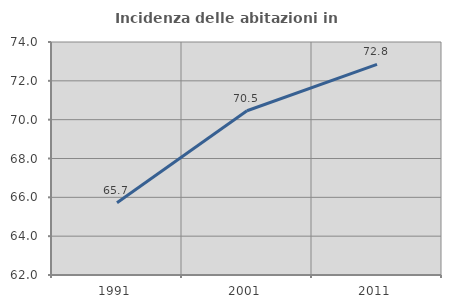
| Category | Incidenza delle abitazioni in proprietà  |
|---|---|
| 1991.0 | 65.718 |
| 2001.0 | 70.46 |
| 2011.0 | 72.847 |